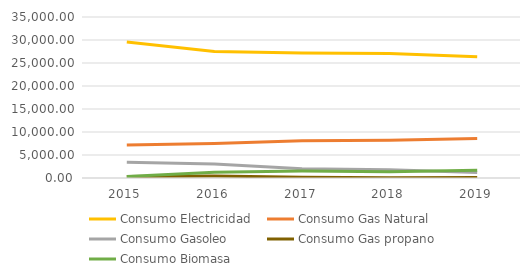
| Category | Consumo Electricidad | Consumo Gas Natural | Consumo Gasoleo | Consumo Gas propano | Consumo Biomasa |
|---|---|---|---|---|---|
| 2015.0 | 29577.137 | 7148.77 | 3442.753 | 349.816 | 324.59 |
| 2016.0 | 27514.228 | 7525.71 | 3020.131 | 443.033 | 1240.846 |
| 2017.0 | 27195.748 | 8080.076 | 1998.899 | 145.773 | 1498.609 |
| 2018.0 | 27078.536 | 8225.553 | 1802.348 | 39.569 | 1366.364 |
| 2019.0 | 26359.254 | 8600.568 | 1170.121 | 109.595 | 1671.752 |